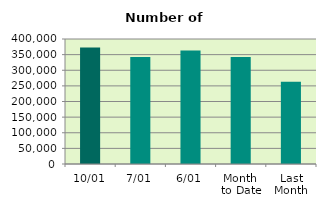
| Category | Series 0 |
|---|---|
| 10/01 | 372516 |
| 7/01 | 342238 |
| 6/01 | 363318 |
| Month 
to Date | 342280 |
| Last
Month | 263242 |